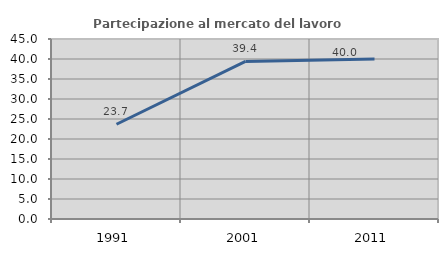
| Category | Partecipazione al mercato del lavoro  femminile |
|---|---|
| 1991.0 | 23.684 |
| 2001.0 | 39.394 |
| 2011.0 | 40 |